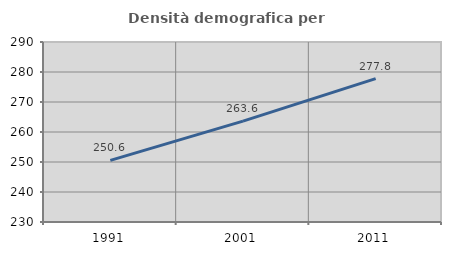
| Category | Densità demografica |
|---|---|
| 1991.0 | 250.561 |
| 2001.0 | 263.617 |
| 2011.0 | 277.801 |